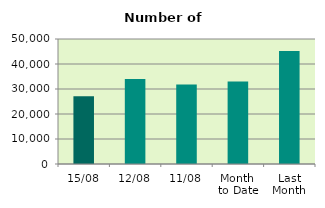
| Category | Series 0 |
|---|---|
| 15/08 | 27056 |
| 12/08 | 33974 |
| 11/08 | 31806 |
| Month 
to Date | 33048.727 |
| Last
Month | 45220.286 |